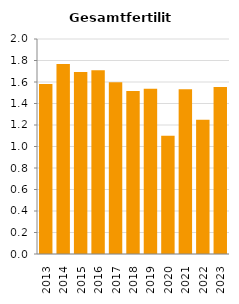
| Category | Gesamtfertilität |
|---|---|
| 2013.0 | 1.582 |
| 2014.0 | 1.768 |
| 2015.0 | 1.692 |
| 2016.0 | 1.71 |
| 2017.0 | 1.598 |
| 2018.0 | 1.517 |
| 2019.0 | 1.538 |
| 2020.0 | 1.1 |
| 2021.0 | 1.531 |
| 2022.0 | 1.25 |
| 2023.0 | 1.553 |